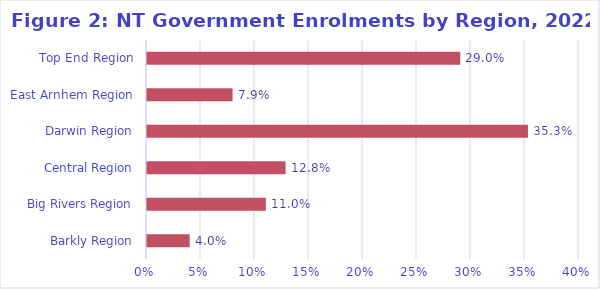
| Category | Series 0 |
|---|---|
| Barkly Region | 0.04 |
| Big Rivers Region | 0.11 |
| Central Region | 0.128 |
| Darwin Region | 0.353 |
| East Arnhem Region | 0.079 |
| Top End Region | 0.29 |